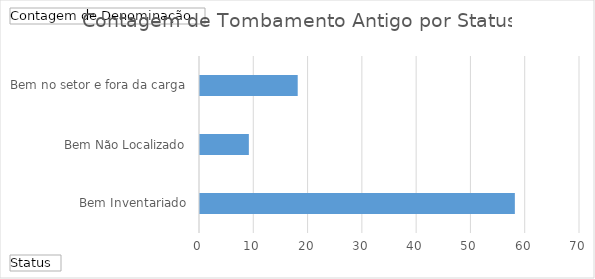
| Category | Total |
|---|---|
| Bem Inventariado | 58 |
| Bem Não Localizado | 9 |
| Bem no setor e fora da carga | 18 |